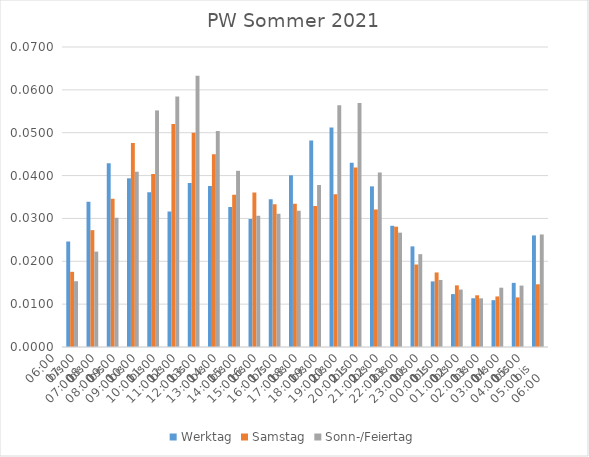
| Category | Werktag | Samstag | Sonn-/Feiertag |
|---|---|---|---|
| 06:00
bis
07:00 | 0.025 | 0.018 | 0.015 |
| 07:00
bis
08:00 | 0.034 | 0.027 | 0.022 |
| 08:00
bis
09:00 | 0.043 | 0.035 | 0.03 |
| 09:00
bis
10:00 | 0.039 | 0.048 | 0.041 |
| 10:00
bis
11:00 | 0.036 | 0.04 | 0.055 |
| 11:00
bis
12:00 | 0.032 | 0.052 | 0.058 |
| 12:00
bis
13:00 | 0.038 | 0.05 | 0.063 |
| 13:00
bis
14:00 | 0.038 | 0.045 | 0.05 |
| 14:00
bis
15:00 | 0.033 | 0.036 | 0.041 |
| 15:00
bis
16:00 | 0.03 | 0.036 | 0.031 |
| 16:00
bis
17:00 | 0.034 | 0.033 | 0.031 |
| 17:00
bis
18:00 | 0.04 | 0.033 | 0.032 |
| 18:00
bis
19:00 | 0.048 | 0.033 | 0.038 |
| 19:00
bis
20:00 | 0.051 | 0.036 | 0.056 |
| 20:00
bis
21:00 | 0.043 | 0.042 | 0.057 |
| 21:00
bis
22:00 | 0.037 | 0.032 | 0.041 |
| 22:00
bis
23:00 | 0.028 | 0.028 | 0.027 |
| 23:00
bis
00:00 | 0.023 | 0.019 | 0.022 |
| 00:00
bis
01:00 | 0.015 | 0.017 | 0.016 |
| 01:00
bis
02:00 | 0.012 | 0.014 | 0.013 |
| 02:00
bis
03:00 | 0.011 | 0.012 | 0.011 |
| 03:00
bis
04:00 | 0.011 | 0.012 | 0.014 |
| 04:00
bis
05:00 | 0.015 | 0.012 | 0.014 |
| 05:00
bis
06:00 | 0.026 | 0.015 | 0.026 |